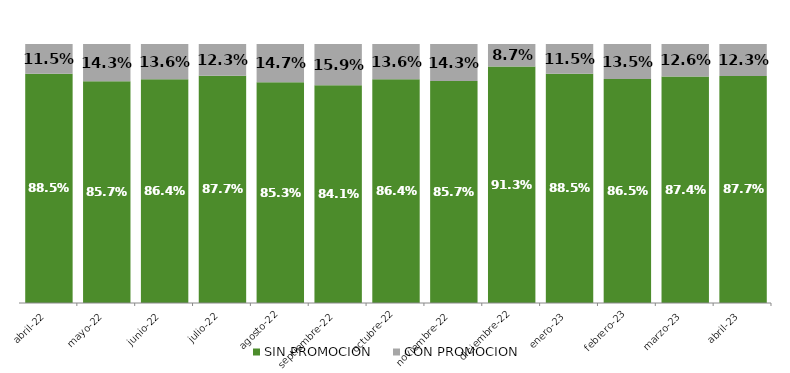
| Category | SIN PROMOCION   | CON PROMOCION   |
|---|---|---|
| 2022-04-01 | 0.885 | 0.115 |
| 2022-05-01 | 0.857 | 0.143 |
| 2022-06-01 | 0.864 | 0.136 |
| 2022-07-01 | 0.877 | 0.123 |
| 2022-08-01 | 0.853 | 0.147 |
| 2022-09-01 | 0.841 | 0.159 |
| 2022-10-01 | 0.864 | 0.136 |
| 2022-11-01 | 0.857 | 0.143 |
| 2022-12-01 | 0.913 | 0.087 |
| 2023-01-01 | 0.885 | 0.115 |
| 2023-02-01 | 0.865 | 0.135 |
| 2023-03-01 | 0.874 | 0.126 |
| 2023-04-01 | 0.877 | 0.123 |